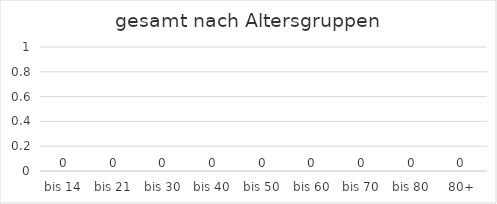
| Category | gesamt |
|---|---|
| bis 14 | 0 |
| bis 21 | 0 |
| bis 30 | 0 |
| bis 40 | 0 |
| bis 50 | 0 |
| bis 60 | 0 |
| bis 70 | 0 |
| bis 80 | 0 |
| 80+ | 0 |